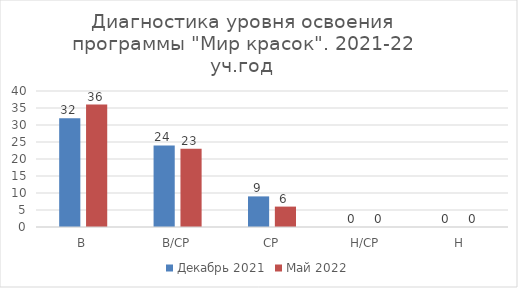
| Category | Декабрь 2021 | Май 2022 |
|---|---|---|
| В | 32 | 36 |
| В/СР | 24 | 23 |
| СР | 9 | 6 |
| Н/СР | 0 | 0 |
| Н | 0 | 0 |